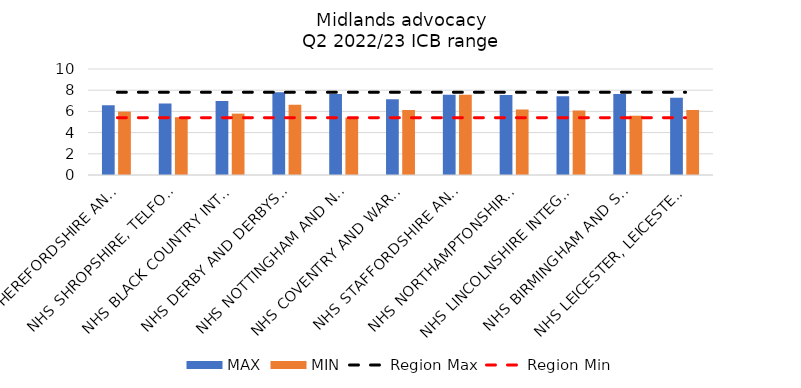
| Category | MAX | MIN |
|---|---|---|
| NHS HEREFORDSHIRE AND WORCESTERSHIRE INTEGRATED CARE BOARD | 6.588 | 5.985 |
| NHS SHROPSHIRE, TELFORD AND WREKIN INTEGRATED CARE BOARD | 6.75 | 5.453 |
| NHS BLACK COUNTRY INTEGRATED CARE BOARD | 6.989 | 5.789 |
| NHS DERBY AND DERBYSHIRE INTEGRATED CARE BOARD | 7.805 | 6.634 |
| NHS NOTTINGHAM AND NOTTINGHAMSHIRE INTEGRATED CARE BOARD | 7.637 | 5.411 |
| NHS COVENTRY AND WARWICKSHIRE INTEGRATED CARE BOARD | 7.155 | 6.126 |
| NHS STAFFORDSHIRE AND STOKE-ON-TRENT INTEGRATED CARE BOARD | 7.578 | 7.578 |
| NHS NORTHAMPTONSHIRE INTEGRATED CARE BOARD | 7.556 | 6.168 |
| NHS LINCOLNSHIRE INTEGRATED CARE BOARD | 7.425 | 6.096 |
| NHS BIRMINGHAM AND SOLIHULL INTEGRATED CARE BOARD | 7.635 | 5.594 |
| NHS LEICESTER, LEICESTERSHIRE AND RUTLAND INTEGRATED CARE BOARD | 7.279 | 6.132 |